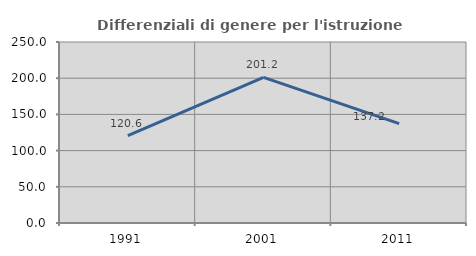
| Category | Differenziali di genere per l'istruzione superiore |
|---|---|
| 1991.0 | 120.616 |
| 2001.0 | 201.248 |
| 2011.0 | 137.204 |